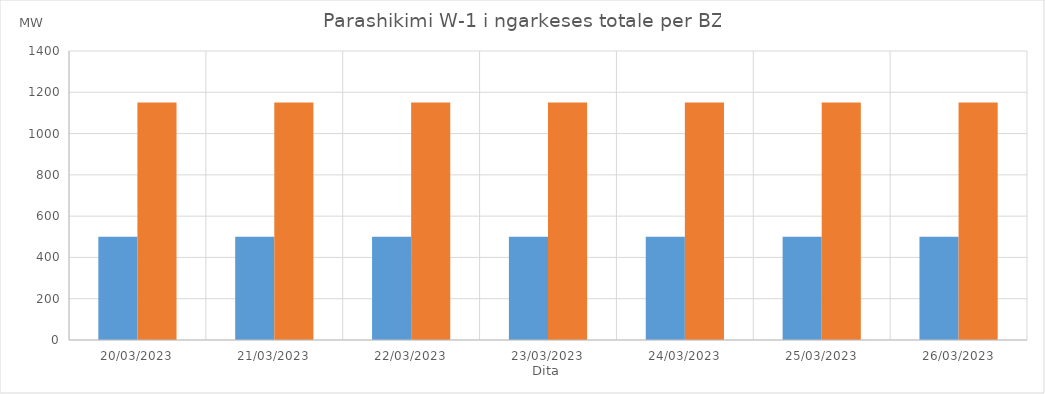
| Category | Min (MW) | Max (MW) |
|---|---|---|
| 20/03/2023 | 500 | 1150 |
| 21/03/2023 | 500 | 1150 |
| 22/03/2023 | 500 | 1150 |
| 23/03/2023 | 500 | 1150 |
| 24/03/2023 | 500 | 1150 |
| 25/03/2023 | 500 | 1150 |
| 26/03/2023 | 500 | 1150 |